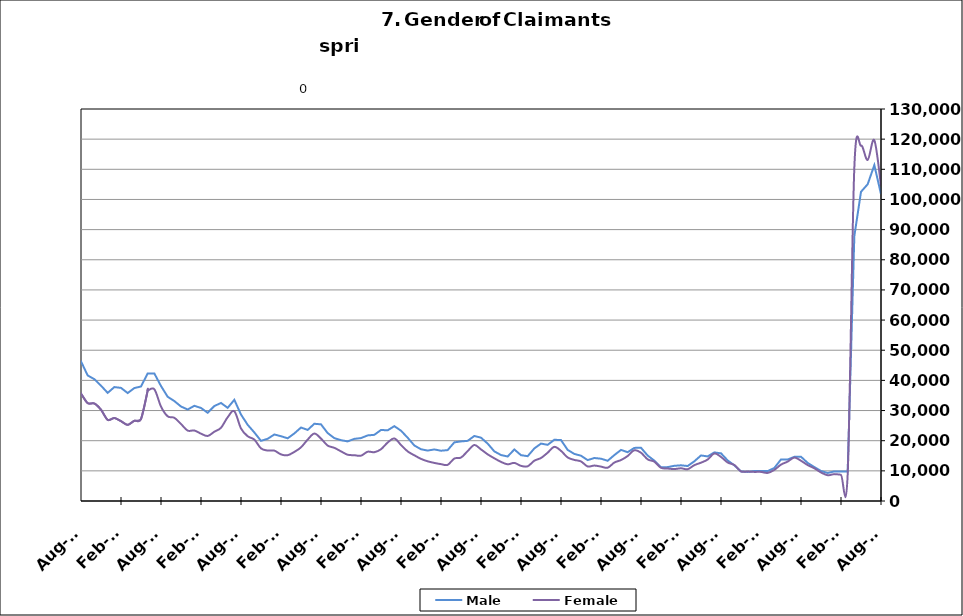
| Category | Male | Female |
|---|---|---|
| 1995-02-28 | 11910 | 7689 |
| 1995-03-31 | 12528 | 7887 |
| 1995-04-30 | 14119 | 8295 |
| 1995-05-31 | 15153 | 8659 |
| 1995-06-30 | 14654 | 9963 |
| 1995-07-31 | 16478 | 11435 |
| 1995-08-31 | 16264 | 11011 |
| 1995-09-30 | 13352 | 9104 |
| 1995-10-31 | 11499 | 8670 |
| 1995-11-30 | 10418 | 7960 |
| 1995-12-31 | 11010 | 7787 |
| 1996-01-31 | 11539 | 7863 |
| 1996-02-29 | 12768 | 7894 |
| 1996-03-31 | 13246 | 7755 |
| 1996-04-30 | 16021 | 8296 |
| 1996-05-31 | 15929 | 8751 |
| 1996-06-30 | 15291 | 10224 |
| 1996-07-31 | 17229 | 11535 |
| 1996-08-31 | 16317 | 10611 |
| 1996-09-30 | 13793 | 8812 |
| 1996-10-31 | 11431 | 8215 |
| 1996-11-30 | 10510 | 7751 |
| 1996-12-31 | 10023 | 7185 |
| 1997-01-31 | 12006 | 7404 |
| 1997-02-28 | 11976 | 7384 |
| 1997-03-31 | 11924 | 7078 |
| 1997-04-30 | 13098 | 7454 |
| 1997-05-31 | 13763 | 8032 |
| 1997-06-30 | 12872 | 9377 |
| 1997-07-31 | 15358 | 10550 |
| 1997-08-31 | 14888 | 9776 |
| 1997-09-30 | 12307 | 8016 |
| 1997-10-31 | 10749.5 | 7444 |
| 1997-11-30 | 9192 | 6872 |
| 1997-12-31 | 8541 | 6180 |
| 1998-01-31 | 9230 | 6563 |
| 1998-02-28 | 9286 | 6048 |
| 1998-03-31 | 9805 | 6012 |
| 1998-04-30 | 12254 | 7080 |
| 1998-05-31 | 13029 | 7509 |
| 1998-06-30 | 12376 | 9201 |
| 1998-07-31 | 14264 | 10448 |
| 1998-08-31 | 14319 | 9908 |
| 1998-09-30 | 12515 | 8202 |
| 1998-10-31 | 9927 | 7502 |
| 1998-11-30 | 9481 | 7563 |
| 1998-12-31 | 9422 | 7289 |
| 1999-01-31 | 10826 | 7829 |
| 1999-02-28 | 10614 | 7417 |
| 1999-03-31 | 10596 | 7180 |
| 1999-04-30 | 14139 | 8377 |
| 1999-05-31 | 14748 | 8508 |
| 1999-06-30 | 13399 | 9753 |
| 1999-07-31 | 16831 | 11294 |
| 1999-08-31 | 17466 | 10502 |
| 1999-09-30 | 14075 | 8356 |
| 1999-10-31 | 11344 | 7743 |
| 1999-11-30 | 10401 | 7623 |
| 1999-12-31 | 9702 | 6793 |
| 2000-01-31 | 10263 | 7252 |
| 2000-02-29 | 10217 | 7054 |
| 2000-03-31 | 10848 | 6860 |
| 2000-04-30 | 13099 | 8062 |
| 2000-05-31 | 13692 | 8388 |
| 2000-06-30 | 13498 | 10306 |
| 2000-07-31 | 15682 | 11874 |
| 2000-08-31 | 15407 | 10967 |
| 2000-09-30 | 12230 | 8808 |
| 2000-10-31 | 10182 | 8230 |
| 2000-11-30 | 9376 | 8049 |
| 2000-12-31 | 9229 | 7777 |
| 2001-01-31 | 10264 | 8400 |
| 2001-02-28 | 11709 | 8801 |
| 2001-03-31 | 9919 | 7036 |
| 2001-04-30 | 17255 | 11559 |
| 2001-05-31 | 18656 | 12219 |
| 2001-06-30 | 19590 | 15536 |
| 2001-07-31 | 22235 | 17388 |
| 2001-08-31 | 22550 | 16255 |
| 2001-09-30 | 20719 | 15193 |
| 2001-10-31 | 20761 | 15705 |
| 2001-11-30 | 22570 | 16084 |
| 2001-12-31 | 24429 | 16497 |
| 2002-01-31 | 26188 | 17125 |
| 2002-02-28 | 27071 | 16705 |
| 2002-03-31 | 26691 | 16475 |
| 2002-04-30 | 32125 | 20940 |
| 2002-05-31 | 31589 | 20115 |
| 2002-06-30 | 30220 | 21952 |
| 2002-07-31 | 30981 | 23132 |
| 2002-08-31 | 23858 | 16993 |
| 2002-09-30 | 27757 | 19832 |
| 2002-10-31 | 25023 | 18451 |
| 2002-11-30 | 24331 | 17763 |
| 2002-12-31 | 24361 | 17175 |
| 2003-01-31 | 24361 | 17175 |
| 2003-02-28 | 26133 | 17155 |
| 2003-03-31 | 26934 | 17491 |
| 2003-04-30 | 29393 | 19122 |
| 2003-05-31 | 30480 | 19811 |
| 2003-06-30 | 30177 | 22643 |
| 2003-07-31 | 30615 | 23565 |
| 2003-08-31 | 29860 | 22195 |
| 2003-09-30 | 26777 | 19925 |
| 2003-10-31 | 23899 | 18782 |
| 2003-11-30 | 22247 | 17944 |
| 2003-12-31 | 20902 | 16829 |
| 2004-01-31 | 20479 | 15794 |
| 2004-02-29 | 18869 | 14174 |
| 2004-03-31 | 18157 | 13452 |
| 2004-04-30 | 20525 | 14655 |
| 2004-05-31 | 20588 | 14975 |
| 2004-06-30 | 20148 | 17494 |
| 2004-07-31 | 22098 | 19064 |
| 2004-08-31 | 20778 | 16925 |
| 2004-09-30 | 17457 | 14258 |
| 2004-10-31 | 15548 | 13549 |
| 2004-11-30 | 14919 | 12836 |
| 2004-12-31 | 14200 | 11711 |
| 2005-01-31 | 14968 | 11918 |
| 2005-02-28 | 14478 | 11045 |
| 2005-03-31 | 13958 | 10426 |
| 2005-04-30 | 15898 | 11682 |
| 2005-05-31 | 16188 | 11900 |
| 2005-06-30 | 15549 | 14256 |
| 2005-07-31 | 16728 | 15274 |
| 2005-08-31 | 16418 | 13314 |
| 2005-09-30 | 12729 | 10857 |
| 2005-10-31 | 11493 | 10421 |
| 2005-11-30 | 10480 | 9638 |
| 2005-12-31 | 9482 | 8742 |
| 2006-01-31 | 9638 | 8761 |
| 2006-02-28 | 8844 | 7847 |
| 2006-03-31 | 9353 | 7709 |
| 2006-04-30 | 11916 | 9300 |
| 2006-05-31 | 12755 | 10017 |
| 2006-06-30 | 12840 | 12614 |
| 2006-07-31 | 14534 | 14007 |
| 2006-08-31 | 14510 | 12902 |
| 2006-09-30 | 12359 | 10850 |
| 2006-10-31 | 11360 | 10309 |
| 2006-11-30 | 10702 | 9403 |
| 2006-12-31 | 10886 | 9298 |
| 2007-01-31 | 11619 | 9539 |
| 2007-02-28 | 12137 | 9112 |
| 2007-03-31 | 12434 | 9125 |
| 2007-04-30 | 14864 | 10520 |
| 2007-05-31 | 16656 | 11730 |
| 2007-06-30 | 16711 | 14024 |
| 2007-07-31 | 18458 | 15882 |
| 2007-08-31 | 17879 | 14187 |
| 2007-09-30 | 16538 | 13586 |
| 2007-10-31 | 15458 | 13070 |
| 2007-11-15 | 14626 | 12172 |
| 2007-12-15 09:36:00 | 15625 | 12363 |
| 2008-01-14 19:12:00 | 17236 | 12936 |
| 2008-02-14 04:48:00 | 18262 | 12696 |
| 2008-03-15 14:24:00 | 19119 | 13263 |
| 2008-04-15 | 22039 | 15054 |
| 2008-05-15 09:36:00 | 24402 | 16733 |
| 2008-06-14 19:12:00 | 25155 | 19969 |
| 2008-07-15 04:48:00 | 27499 | 22268 |
| 2008-08-14 14:24:00 | 29286 | 21514 |
| 2008-09-14 | 30571 | 21776 |
| 2008-10-14 09:36:00 | 32282 | 22190 |
| 2008-11-13 19:12:00 | 36325 | 23395 |
| 2008-12-14 04:48:00 | 42012 | 25046 |
| 2009-01-13 14:24:00 | 49131 | 27148 |
| 2009-02-13 | 56509 | 29774 |
| 2009-03-15 09:36:00 | 63334 | 33788 |
| 2009-04-14 19:12:00 | 69062 | 36842 |
| 2009-05-15 04:48:00 | 69914 | 37773 |
| 2009-06-14 14:24:00 | 69512 | 42787 |
| 2009-07-15 | 71226 | 46347 |
| 2009-08-14 09:36:00 | 68777 | 43130 |
| 2009-09-13 19:12:00 | 65993 | 41526 |
| 2009-10-14 04:48:00 | 62480 | 40217 |
| 2009-11-13 14:24:00 | 60354 | 38454 |
| 2009-12-14 | 59507 | 36101 |
| 2010-01-13 09:36:00 | 58501 | 35014 |
| 2010-02-12 19:12:00 | 55590 | 32911 |
| 2010-03-15 04:48:00 | 53238 | 31883 |
| 2010-04-14 14:24:00 | 52264 | 32995 |
| 2010-05-15 | 50301 | 32394 |
| 2010-06-14 09:36:00 | 48130 | 36605 |
| 2010-07-14 19:12:00 | 48060 | 38748 |
| 2010-08-14 04:48:00 | 46311 | 35599 |
| 2010-09-13 14:24:00 | 41641 | 32453 |
| 2010-10-14 | 40403 | 32335 |
| 2010-11-13 09:36:00 | 38250 | 30275 |
| 2010-12-13 19:12:00 | 35858 | 26887 |
| 2011-01-13 04:48:00 | 37777 | 27522 |
| 2011-02-12 14:24:00 | 37515 | 26470 |
| 2011-03-15 | 35802 | 25248 |
| 2011-04-14 09:36:00 | 37452 | 26608 |
| 2011-05-14 19:12:00 | 37975 | 27212 |
| 2011-06-14 04:48:00 | 42289 | 36578 |
| 2011-07-14 14:24:00 | 42307 | 37061 |
| 2011-08-14 | 38125 | 31317 |
| 2011-09-13 09:36:00 | 34564 | 28090 |
| 2011-10-13 19:12:00 | 33146 | 27591 |
| 2011-11-13 04:48:00 | 31337 | 25538 |
| 2011-12-13 14:24:00 | 30334 | 23349 |
| 2012-01-13 | 31566 | 23385 |
| 2012-02-12 09:36:00 | 30859 | 22326 |
| 2012-03-13 19:12:00 | 29261 | 21568 |
| 2012-04-13 04:48:00 | 31494 | 22964 |
| 2012-05-13 14:24:00 | 32509 | 24284 |
| 2012-06-13 | 30900 | 27768 |
| 2012-07-13 09:36:00 | 33549 | 29756 |
| 2012-08-12 19:12:00 | 28663 | 24059 |
| 2012-09-12 04:48:00 | 25271 | 21482 |
| 2012-10-12 14:24:00 | 22730 | 20363 |
| 2012-11-12 | 19953 | 17450 |
| 2012-12-12 09:36:00 | 20635 | 16737 |
| 2013-01-11 19:12:00 | 22057 | 16712 |
| 2013-02-11 04:48:00 | 21486 | 15451 |
| 2013-03-13 14:24:00 | 20791 | 15186 |
| 2013-04-13 | 22409 | 16286 |
| 2013-05-13 09:36:00 | 24366 | 17794 |
| 2013-06-12 19:12:00 | 23573 | 20360 |
| 2013-07-13 04:48:00 | 25613 | 22369 |
| 2013-08-12 14:24:00 | 25420 | 20697 |
| 2013-09-12 | 22525 | 18385 |
| 2013-10-12 09:36:00 | 20848 | 17632 |
| 2013-11-11 19:12:00 | 20174 | 16466 |
| 2013-12-12 04:48:00 | 19765 | 15343 |
| 2014-01-11 14:24:00 | 20604 | 15183 |
| 2014-02-11 | 20864 | 15026 |
| 2014-03-13 09:36:00 | 21751 | 16343 |
| 2014-04-12 19:12:00 | 21948 | 16190 |
| 2014-05-13 04:48:00 | 23554 | 17163 |
| 2014-06-12 14:24:00 | 23446 | 19393 |
| 2014-07-13 | 24827 | 20751 |
| 2014-08-14 | 23315 | 18575 |
| 2014-09-13 09:36:00 | 20988 | 16453 |
| 2014-10-13 19:12:00 | 18411 | 15157 |
| 2014-11-13 04:48:00 | 17155 | 13975 |
| 2014-12-13 14:24:00 | 16727 | 13162 |
| 2015-01-13 | 17097 | 12633 |
| 2015-02-12 09:36:00 | 16674 | 12222 |
| 2015-03-14 19:12:00 | 16878 | 11988 |
| 2015-04-14 04:48:00 | 19448 | 14078 |
| 2015-05-14 14:24:00 | 19759 | 14413 |
| 2015-06-14 | 19952 | 16548 |
| 2015-07-14 09:36:00 | 21569 | 18572 |
| 2015-08-13 19:12:00 | 21001 | 17106 |
| 2015-09-13 04:48:00 | 19028 | 15475 |
| 2015-10-13 14:24:00 | 16459 | 14160 |
| 2015-11-13 | 15246 | 12968 |
| 2015-12-13 09:36:00 | 14756 | 12166 |
| 2016-01-12 19:12:00 | 17097 | 12633 |
| 2016-02-12 04:48:00 | 15198 | 11659 |
| 2016-03-13 14:24:00 | 14862 | 11506 |
| 2016-04-13 | 17432 | 13364 |
| 2016-05-13 09:36:00 | 19040 | 14264 |
| 2016-06-12 19:12:00 | 18628 | 16024 |
| 2016-07-13 04:48:00 | 20305 | 17959 |
| 2016-08-12 14:24:00 | 20204 | 16625 |
| 2016-09-12 | 16946 | 14443 |
| 2016-10-12 09:36:00 | 15612 | 13624 |
| 2016-11-11 19:12:00 | 15023 | 13122 |
| 2016-12-12 04:48:00 | 13560 | 11454 |
| 2017-01-11 14:24:00 | 14257 | 11754 |
| 2017-02-11 | 14028 | 11405 |
| 2017-03-13 09:36:00 | 13342 | 11038 |
| 2017-04-12 19:12:00 | 15225 | 12749 |
| 2017-05-13 04:48:00 | 16938 | 13582 |
| 2017-06-12 14:24:00 | 16188 | 14911 |
| 2017-07-13 | 17613 | 16845 |
| 2017-08-12 09:36:00 | 17640 | 16005 |
| 2017-09-11 19:12:00 | 15075 | 13806 |
| 2017-10-12 04:48:00 | 13384 | 13044 |
| 2017-11-11 14:24:00 | 11160 | 11015 |
| 2017-12-12 | 11238 | 10767 |
| 2018-01-11 09:36:00 | 11674 | 10594 |
| 2018-02-10 19:12:00 | 11835 | 10845 |
| 2018-03-13 04:48:00 | 11605 | 10548 |
| 2018-04-12 14:24:00 | 13162 | 11886 |
| 2018-05-13 | 15110 | 12712 |
| 2018-06-12 09:36:00 | 14782 | 13754 |
| 2018-07-12 19:12:00 | 16123 | 15773 |
| 2018-08-12 04:48:00 | 15808 | 14614 |
| 2018-09-11 14:24:00 | 13450 | 12761 |
| 2018-10-12 | 11831 | 11941 |
| 2018-11-11 09:36:00 | 9820 | 9821 |
| 2018-12-11 19:12:00 | 9649 | 9767 |
| 2019-01-11 04:48:00 | 9933 | 9654 |
| 2019-02-10 14:24:00 | 9925 | 9651 |
| 2019-03-13 | 9922 | 9318 |
| 2019-04-12 09:36:00 | 10950 | 10320 |
| 2019-05-12 19:12:00 | 13782 | 12072 |
| 2019-06-12 04:48:00 | 13767 | 13063 |
| 2019-07-12 14:24:00 | 14644 | 14409 |
| 2019-08-12 | 14678 | 13343 |
| 2019-09-11 09:36:00 | 12637 | 11915 |
| 2019-10-11 19:12:00 | 11254 | 10847 |
| 2019-11-11 04:48:00 | 9954 | 9467 |
| 2019-12-11 14:24:00 | 9289 | 8549 |
| 2020-01-11 | 9815 | 8911 |
| 2020-02-10 09:36:00 | 9754 | 8723 |
| 2020-03-11 19:12:00 | 9805 | 8802 |
| 2020-04-11 04:48:00 | 87837 | 110534 |
| 2020-05-11 14:24:00 | 102538 | 117856 |
| 2020-06-11 | 105039 | 113108 |
| 2020-07-11 09:36:00 | 111386 | 119644 |
| 2020-08-10 19:12:00 | 101758 | 104593 |